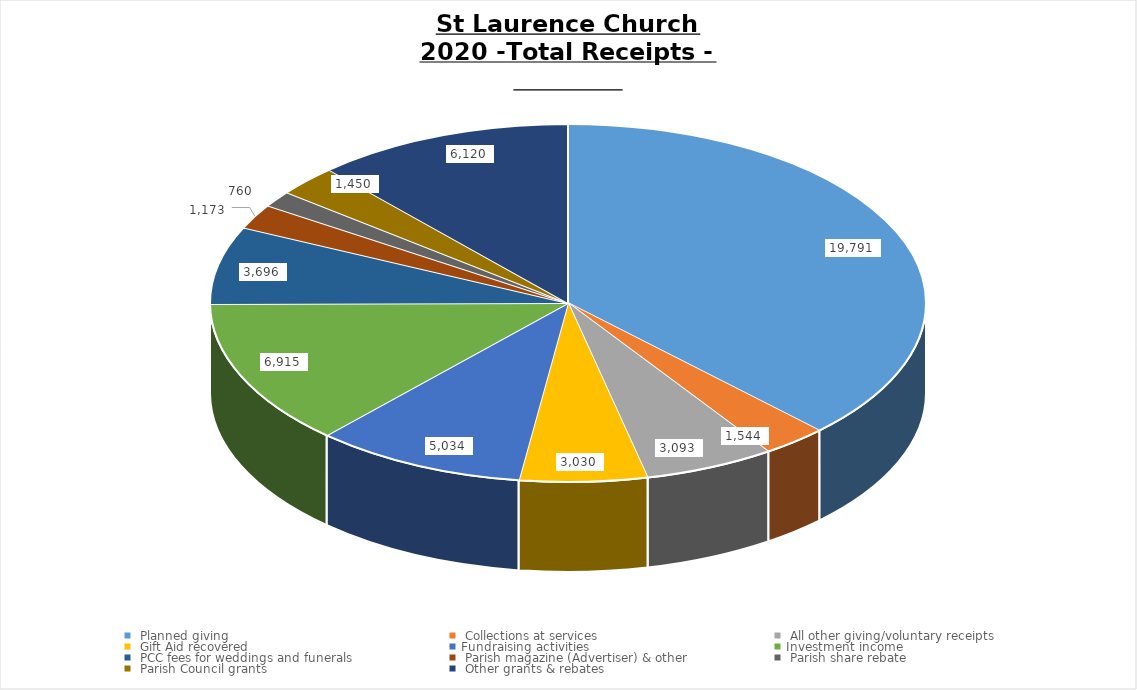
| Category | Series 0 | Series 1 | Series 2 | Series 3 | Series 4 | Series 5 |
|---|---|---|---|---|---|---|
|  Planned giving  |  |  |  |  |  | 19791.24 |
|  Collections at services  |  |  |  |  |  | 1543.5 |
|  All other giving/voluntary receipts  |  |  |  |  |  | 3093.15 |
|  Gift Aid recovered  |  |  |  |  |  | 3030.22 |
| Fundraising activities |  |  |  |  |  | 5034.25 |
| Investment income |  |  |  |  |  | 6915.17 |
|  PCC fees for weddings and funerals  |  |  |  |  |  | 3696 |
|  Parish magazine (Advertiser) & other  |  |  |  |  |  | 1172.8 |
|  Parish share rebate  |  |  |  |  |  | 760.27 |
|  Parish Council grants  |  |  |  |  |  | 1450 |
|  Other grants & rebates  |  |  |  |  |  | 6120.21 |